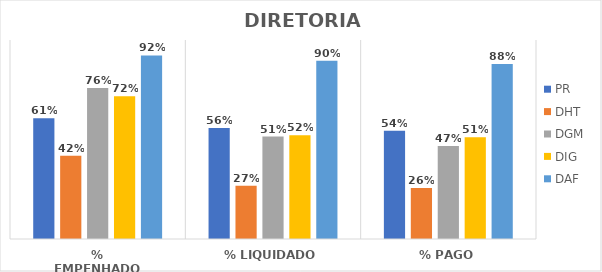
| Category | PR | DHT | DGM | DIG | DAF |
|---|---|---|---|---|---|
| % EMPENHADO | 0.607 | 0.419 | 0.759 | 0.718 | 0.922 |
| % LIQUIDADO | 0.558 | 0.267 | 0.515 | 0.522 | 0.896 |
| % PAGO | 0.543 | 0.256 | 0.468 | 0.511 | 0.879 |